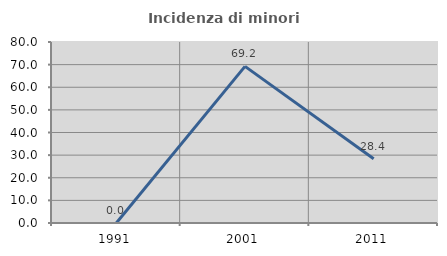
| Category | Incidenza di minori stranieri |
|---|---|
| 1991.0 | 0 |
| 2001.0 | 69.231 |
| 2011.0 | 28.421 |